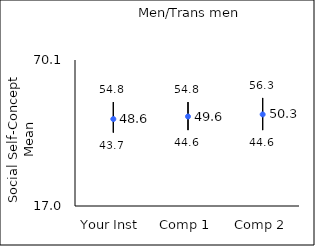
| Category | 25th percentile | 75th percentile | Mean |
|---|---|---|---|
| Your Inst | 43.7 | 54.8 | 48.63 |
| Comp 1 | 44.6 | 54.8 | 49.55 |
| Comp 2 | 44.6 | 56.3 | 50.31 |